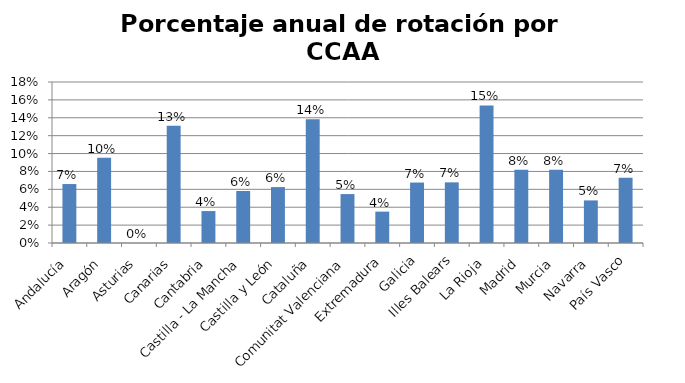
| Category | Porcentaje |
|---|---|
| Andalucía | 0.066 |
| Aragón | 0.095 |
| Asturias | 0 |
| Canarias | 0.131 |
| Cantabria | 0.036 |
| Castilla - La Mancha | 0.058 |
| Castilla y León | 0.062 |
| Cataluña | 0.138 |
| Comunitat Valenciana | 0.055 |
| Extremadura | 0.035 |
| Galicia | 0.068 |
| Illes Balears | 0.068 |
| La Rioja | 0.154 |
| Madrid | 0.082 |
| Murcia | 0.082 |
| Navarra | 0.048 |
| País Vasco | 0.073 |